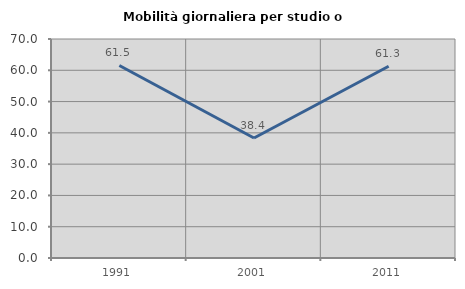
| Category | Mobilità giornaliera per studio o lavoro |
|---|---|
| 1991.0 | 61.538 |
| 2001.0 | 38.372 |
| 2011.0 | 61.29 |